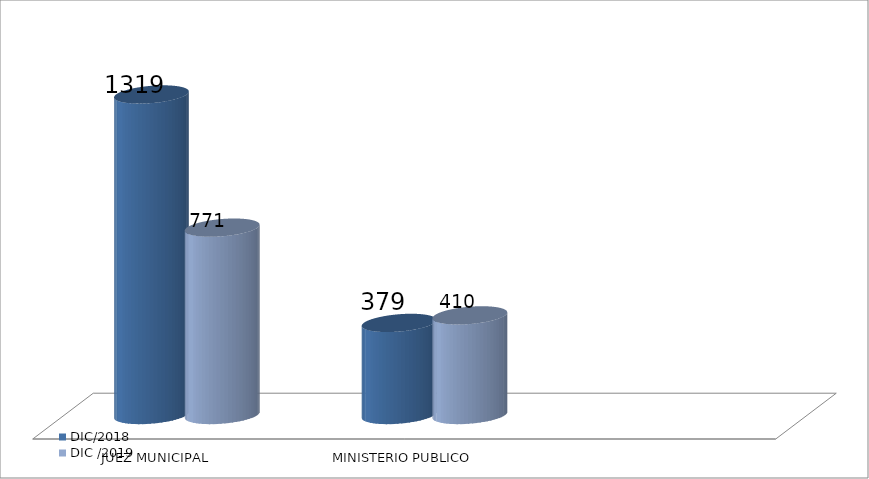
| Category | DIC/2018 | DIC /2019 |
|---|---|---|
| JUEZ MUNICIPAL | 1319 | 771 |
| MINISTERIO PUBLICO | 379 | 410 |